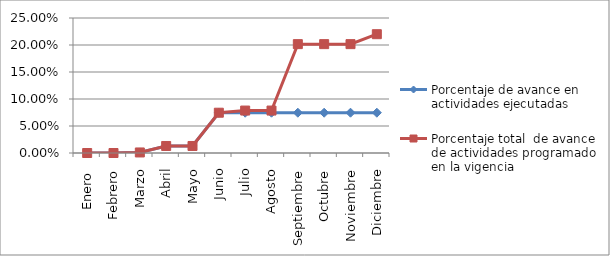
| Category | Porcentaje de avance en actividades ejecutadas | Porcentaje total  de avance de actividades programado en la vigencia |
|---|---|---|
| Enero  | 0 | 0 |
| Febrero | 0 | 0 |
| Marzo | 0.001 | 0.001 |
| Abril | 0.013 | 0.013 |
| Mayo | 0.013 | 0.013 |
| Junio | 0.075 | 0.075 |
| Julio | 0.075 | 0.079 |
| Agosto | 0.075 | 0.079 |
| Septiembre | 0.075 | 0.202 |
| Octubre | 0.075 | 0.202 |
| Noviembre | 0.075 | 0.202 |
| Diciembre | 0.075 | 0.22 |